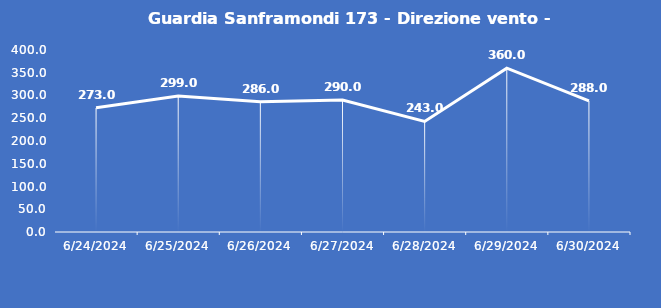
| Category | Guardia Sanframondi 173 - Direzione vento - Grezzo (°N) |
|---|---|
| 6/24/24 | 273 |
| 6/25/24 | 299 |
| 6/26/24 | 286 |
| 6/27/24 | 290 |
| 6/28/24 | 243 |
| 6/29/24 | 360 |
| 6/30/24 | 288 |